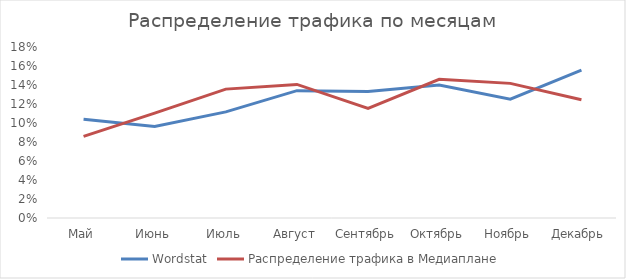
| Category | Wordstat | Распределение трафика в Медиаплане |
|---|---|---|
| Май | 0.104 | 0.086 |
| Июнь | 0.096 | 0.11 |
| Июль | 0.112 | 0.136 |
| Август | 0.134 | 0.141 |
| Сентябрь | 0.133 | 0.115 |
| Октябрь | 0.14 | 0.146 |
| Ноябрь | 0.125 | 0.142 |
| Декабрь | 0.156 | 0.124 |